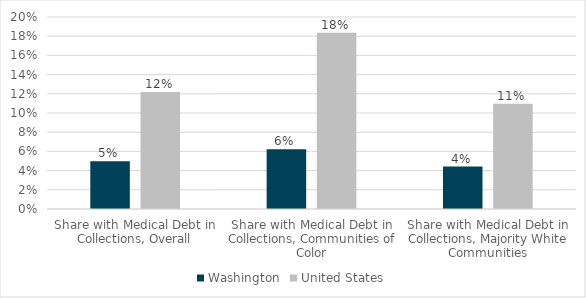
| Category | Washington | United States |
|---|---|---|
| Share with Medical Debt in Collections, Overall | 0.05 | 0.122 |
| Share with Medical Debt in Collections, Communities of Color | 0.062 | 0.184 |
| Share with Medical Debt in Collections, Majority White Communities | 0.044 | 0.11 |